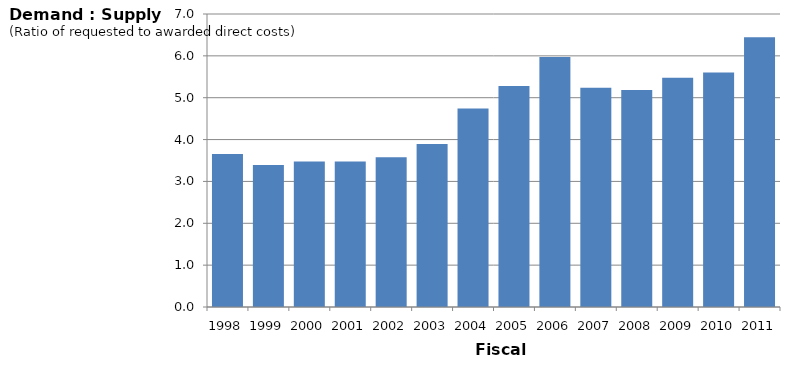
| Category | Series 0 |
|---|---|
| 1998.0 | 3.656 |
| 1999.0 | 3.392 |
| 2000.0 | 3.476 |
| 2001.0 | 3.476 |
| 2002.0 | 3.578 |
| 2003.0 | 3.897 |
| 2004.0 | 4.744 |
| 2005.0 | 5.278 |
| 2006.0 | 5.975 |
| 2007.0 | 5.235 |
| 2008.0 | 5.183 |
| 2009.0 | 5.478 |
| 2010.0 | 5.603 |
| 2011.0 | 6.442 |